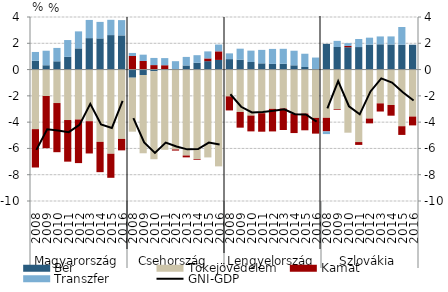
| Category | Bér | Tőkejövedelem | Kamat | Transzfer |
|---|---|---|---|---|
| 0 | 0.664 | -4.532 | -2.919 | 0.675 |
| 1 | 0.329 | -2.01 | -3.971 | 1.105 |
| 2 | 0.629 | -2.546 | -3.74 | 1.018 |
| 3 | 0.968 | -3.839 | -3.167 | 1.279 |
| 4 | 1.614 | -3.8 | -3.316 | 1.293 |
| 5 | 2.392 | -3.93 | -2.454 | 1.385 |
| 6 | 2.373 | -5.499 | -2.307 | 1.255 |
| 7 | 2.623 | -6.405 | -1.831 | 1.164 |
| 8 | 2.601 | -5.275 | -0.872 | 1.162 |
| 9 | -0.617 | -4.107 | 1.033 | 0.232 |
| 10 | -0.414 | -5.955 | 0.655 | 0.48 |
| 11 | -0.129 | -6.692 | 0.341 | 0.544 |
| 12 | -0.056 | -6.047 | 0.331 | 0.543 |
| 13 | 0.037 | -6.077 | -0.087 | 0.602 |
| 14 | 0.314 | -6.54 | -0.139 | 0.649 |
| 15 | 0.516 | -6.808 | -0.055 | 0.579 |
| 16 | 0.64 | -6.685 | 0.209 | 0.534 |
| 17 | 0.734 | -7.365 | 0.654 | 0.516 |
| 18 | 0.796 | -2.039 | -1.07 | 0.437 |
| 19 | 0.752 | -3.224 | -1.196 | 0.838 |
| 20 | 0.578 | -3.5 | -1.203 | 0.865 |
| 21 | 0.474 | -3.318 | -1.409 | 1.024 |
| 22 | 0.432 | -2.988 | -1.718 | 1.14 |
| 23 | 0.442 | -2.96 | -1.638 | 1.138 |
| 24 | 0.324 | -3.35 | -1.481 | 1.11 |
| 25 | 0.195 | -3.346 | -1.275 | 1.01 |
| 26 | -0.028 | -3.647 | -1.198 | 0.915 |
| 27 | 1.956 | -3.67 | -1.031 | -0.207 |
| 28 | 1.718 | -3.008 | -0.053 | 0.467 |
| 29 | 1.698 | -4.803 | 0.101 | 0.213 |
| 30 | 1.713 | -5.517 | -0.215 | 0.613 |
| 31 | 1.898 | -3.727 | -0.364 | 0.53 |
| 32 | 1.925 | -2.573 | -0.619 | 0.596 |
| 33 | 1.908 | -2.696 | -0.813 | 0.614 |
| 34 | 1.886 | -4.311 | -0.661 | 1.354 |
| 35 | 1.885 | -3.576 | -0.672 | 0.013 |